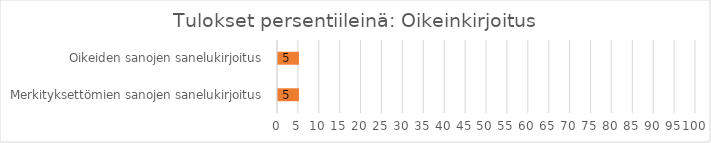
| Category | Tulokset persentiileinä: Oikeinkirjoitus |
|---|---|
| Oikeiden sanojen sanelukirjoitus | 5 |
| Merkityksettömien sanojen sanelukirjoitus | 5 |